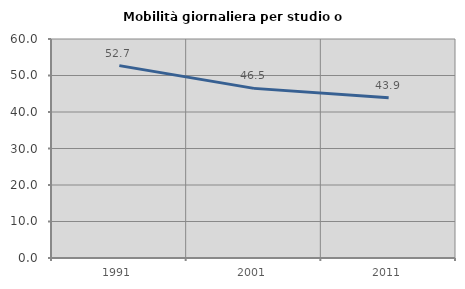
| Category | Mobilità giornaliera per studio o lavoro |
|---|---|
| 1991.0 | 52.705 |
| 2001.0 | 46.473 |
| 2011.0 | 43.88 |